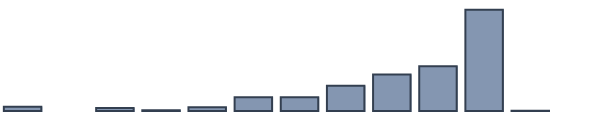
| Category | Series 0 |
|---|---|
| 0 | 1.7 |
| 1 | 0 |
| 2 | 1.2 |
| 3 | 0.3 |
| 4 | 1.5 |
| 5 | 5.6 |
| 6 | 5.6 |
| 7 | 10.2 |
| 8 | 14.8 |
| 9 | 18.1 |
| 10 | 41 |
| 11 | 0.1 |
| 12 | 0 |